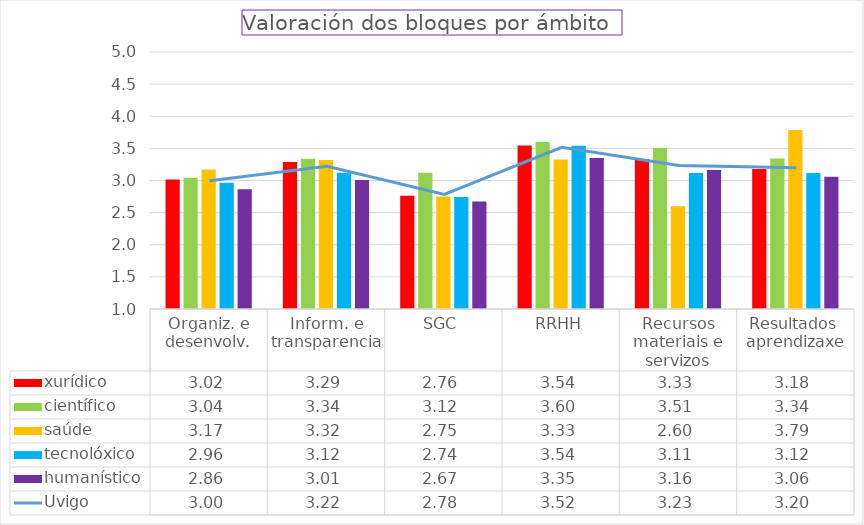
| Category | xurídico | científico | saúde | tecnolóxico | humanístico |
|---|---|---|---|---|---|
| Organiz. e desenvolv. | 3.016 | 3.042 | 3.17 | 2.963 | 2.862 |
| Inform. e transparencia | 3.288 | 3.34 | 3.318 | 3.119 | 3.007 |
| SGC | 2.761 | 3.121 | 2.75 | 2.741 | 2.674 |
| RRHH | 3.545 | 3.601 | 3.327 | 3.541 | 3.351 |
| Recursos materiais e servizos | 3.333 | 3.506 | 2.601 | 3.115 | 3.164 |
| Resultados  aprendizaxe | 3.18 | 3.341 | 3.786 | 3.117 | 3.057 |